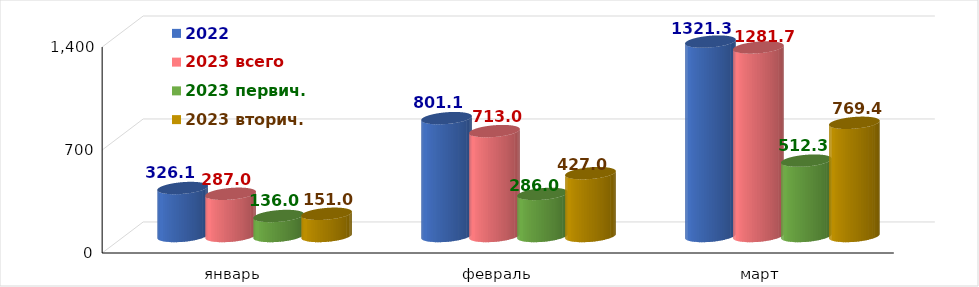
| Category | 2022 | 2023 всего | 2023 первич. | 2023 вторич. |
|---|---|---|---|---|
| январь | 326.136 | 287 | 136 | 151 |
| февраль | 801.124 | 713 | 286 | 427 |
| март | 1321.34 | 1281.7 | 512.3 | 769.4 |